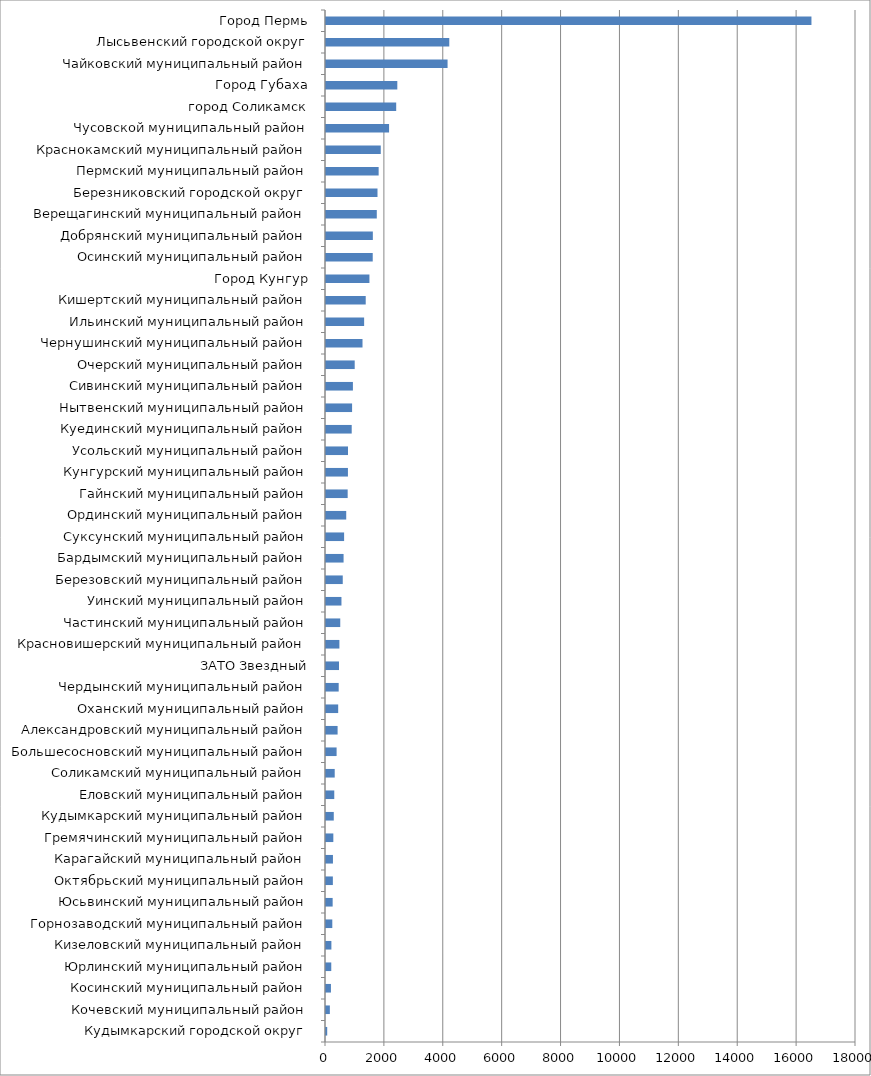
| Category | Series 0 | Series 1 |
|---|---|---|
| Кудымкарский городской округ |  | 41 |
| Кочевский муниципальный район |  | 131 |
| Косинский муниципальный район |  | 168 |
| Юрлинский муниципальный район |  | 179 |
| Кизеловский муниципальный район |  | 183 |
| Горнозаводский муниципальный район |  | 214 |
| Юсьвинский муниципальный район |  | 226 |
| Октябрьский муниципальный район |  | 233 |
| Карагайский муниципальный район |  | 236 |
| Гремячинский муниципальный район |  | 249 |
| Кудымкарский муниципальный район |  | 264 |
| Еловский муниципальный район |  | 281 |
| Соликамский муниципальный район |  | 296 |
| Большесосновский муниципальный район |  | 360 |
| Александровский муниципальный район |  | 394 |
| Оханский муниципальный район |  | 414 |
| Чердынский муниципальный район |  | 431 |
|  ЗАТО Звездный |  | 441 |
| Красновишерский муниципальный район |  | 455 |
| Частинский муниципальный район |  | 484 |
| Уинский муниципальный район |  | 525 |
| Березовский муниципальный район |  | 569 |
| Бардымский муниципальный район |  | 597 |
| Суксунский муниципальный район |  | 615 |
| Ординский муниципальный район |  | 687 |
| Гайнский муниципальный район |  | 736 |
| Кунгурский муниципальный район |  | 745 |
| Усольский муниципальный район |  | 748 |
| Куединский муниципальный район |  | 873 |
| Нытвенский муниципальный район |  | 886 |
| Сивинский муниципальный район |  | 914 |
| Очерский муниципальный район |  | 975 |
| Чернушинский муниципальный район |  | 1240 |
| Ильинский муниципальный район |  | 1295 |
| Кишертский муниципальный район |  | 1349 |
| Город Кунгур |  | 1475 |
| Осинский муниципальный район |  | 1587 |
| Добрянский муниципальный район |  | 1591 |
| Верещагинский муниципальный район |  | 1725 |
| Березниковский городской округ |  | 1749 |
| Пермский муниципальный район |  | 1788 |
| Краснокамский муниципальный район |  | 1860 |
| Чусовской муниципальный район |  | 2142 |
| город Соликамск |  | 2384 |
| Город Губаха |  | 2422 |
| Чайковский муниципальный район |  | 4129 |
| Лысьвенский городской округ |  | 4187 |
| Город Пермь |  | 16487 |